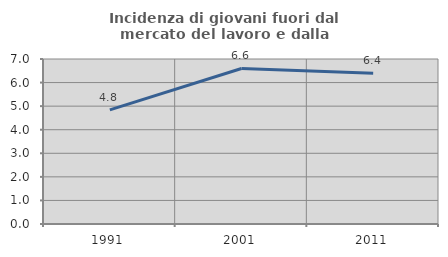
| Category | Incidenza di giovani fuori dal mercato del lavoro e dalla formazione  |
|---|---|
| 1991.0 | 4.843 |
| 2001.0 | 6.597 |
| 2011.0 | 6.399 |